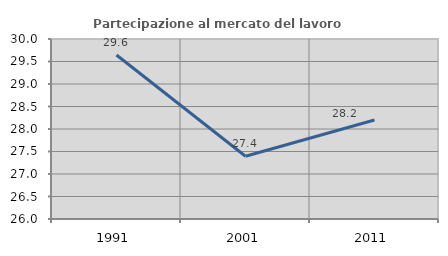
| Category | Partecipazione al mercato del lavoro  femminile |
|---|---|
| 1991.0 | 29.644 |
| 2001.0 | 27.395 |
| 2011.0 | 28.2 |